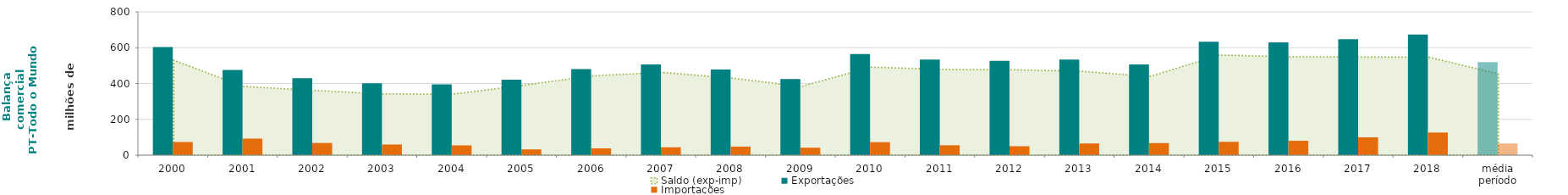
| Category | Exportações  | Importações  |
|---|---|---|
| 2000 | 603.257 | 73.37 |
| 2001 | 476.1 | 92.402 |
| 2002 | 429.586 | 68.07 |
| 2003 | 401.119 | 59.288 |
| 2004 | 394.748 | 54.527 |
| 2005 | 421.259 | 32.137 |
| 2006 | 480.684 | 37.951 |
| 2007 | 506.189 | 43.993 |
| 2008 | 478.345 | 47.836 |
| 2009 | 424.817 | 41.644 |
| 2010 | 564.035 | 72.422 |
| 2011 | 534.142 | 55.21 |
| 2012 | 526.514 | 49.867 |
| 2013 | 534.274 | 65.216 |
| 2014 | 506.348 | 67.339 |
| 2015 | 633.121 | 74.48 |
| 2016 | 629.75 | 80.191 |
| 2017 | 647.86 | 99.579 |
| 2018 | 673.289 | 126.327 |
| média período | 519.233 | 65.36 |